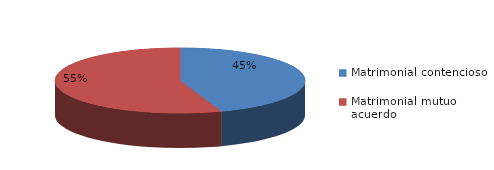
| Category | Series 0 |
|---|---|
| 0 | 752 |
| 1 | 932 |